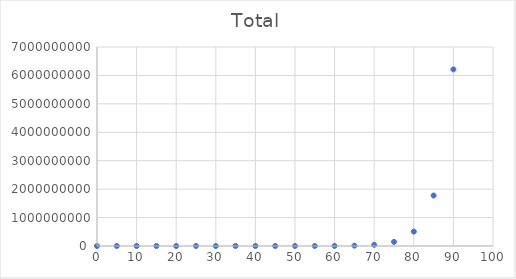
| Category | Total |
|---|---|
| 0.0 | 1 |
| 5.0 | 3.5 |
| 10.0 | 12.25 |
| 15.0 | 42.875 |
| 20.0 | 150.062 |
| 25.0 | 525.219 |
| 30.0 | 1838.266 |
| 35.0 | 6433.93 |
| 40.0 | 22518.754 |
| 45.0 | 78815.639 |
| 50.0 | 275854.735 |
| 55.0 | 965491.574 |
| 60.0 | 3379220.508 |
| 65.0 | 11827271.778 |
| 70.0 | 41395451.224 |
| 75.0 | 144884079.283 |
| 80.0 | 507094277.49 |
| 85.0 | 1774829971.216 |
| 90.0 | 6211904899.256 |